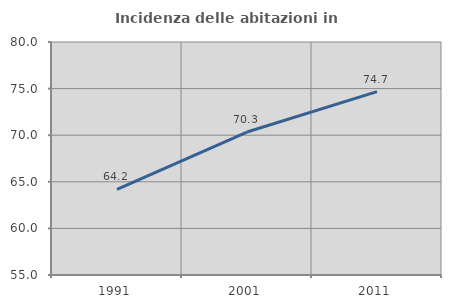
| Category | Incidenza delle abitazioni in proprietà  |
|---|---|
| 1991.0 | 64.186 |
| 2001.0 | 70.343 |
| 2011.0 | 74.677 |